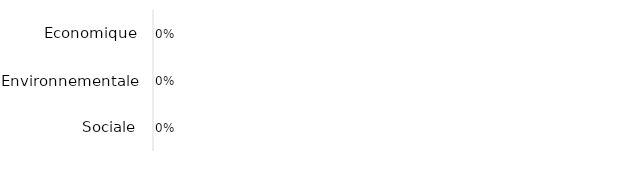
| Category | Series 0 |
|---|---|
| Sociale | 0 |
| Environnementale | 0 |
| Economique | 0 |